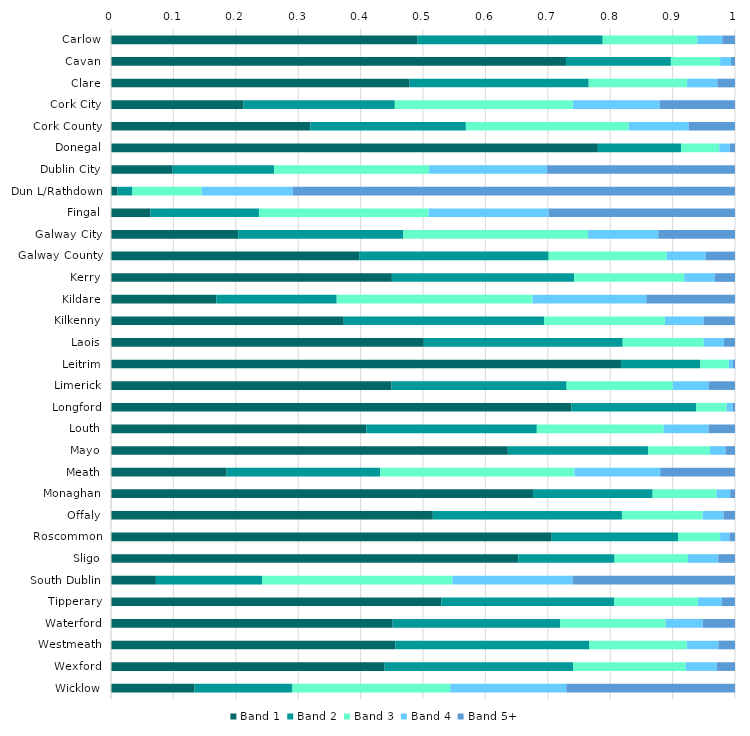
| Category | Band 1 | Band 2 | Band 3 | Band 4 | Band 5+ |
|---|---|---|---|---|---|
| Carlow | 0.491 | 0.297 | 0.152 | 0.04 | 0.02 |
| Cavan | 0.729 | 0.168 | 0.079 | 0.017 | 0.006 |
| Clare | 0.479 | 0.287 | 0.158 | 0.048 | 0.028 |
| Cork City | 0.212 | 0.242 | 0.285 | 0.139 | 0.121 |
| Cork County | 0.32 | 0.249 | 0.261 | 0.096 | 0.074 |
| Donegal | 0.78 | 0.133 | 0.061 | 0.017 | 0.008 |
| Dublin City | 0.099 | 0.163 | 0.248 | 0.189 | 0.301 |
| Dun L/Rathdown | 0.01 | 0.024 | 0.111 | 0.146 | 0.709 |
| Fingal | 0.063 | 0.174 | 0.272 | 0.192 | 0.299 |
| Galway City | 0.204 | 0.265 | 0.296 | 0.112 | 0.123 |
| Galway County | 0.398 | 0.304 | 0.189 | 0.062 | 0.047 |
| Kerry | 0.45 | 0.292 | 0.176 | 0.049 | 0.032 |
| Kildare | 0.169 | 0.193 | 0.314 | 0.182 | 0.142 |
| Kilkenny | 0.373 | 0.321 | 0.194 | 0.062 | 0.05 |
| Laois | 0.501 | 0.319 | 0.13 | 0.033 | 0.018 |
| Leitrim | 0.817 | 0.127 | 0.046 | 0.007 | 0.003 |
| Limerick | 0.45 | 0.28 | 0.17 | 0.057 | 0.042 |
| Longford | 0.738 | 0.2 | 0.049 | 0.01 | 0.004 |
| Louth | 0.409 | 0.273 | 0.203 | 0.072 | 0.042 |
| Mayo | 0.636 | 0.225 | 0.099 | 0.025 | 0.015 |
| Meath | 0.185 | 0.246 | 0.311 | 0.137 | 0.12 |
| Monaghan | 0.676 | 0.192 | 0.102 | 0.022 | 0.008 |
| Offaly | 0.516 | 0.303 | 0.13 | 0.033 | 0.019 |
| Roscommon | 0.706 | 0.202 | 0.067 | 0.015 | 0.009 |
| Sligo | 0.653 | 0.154 | 0.118 | 0.049 | 0.027 |
| South Dublin | 0.072 | 0.17 | 0.305 | 0.193 | 0.26 |
| Tipperary | 0.529 | 0.277 | 0.134 | 0.038 | 0.021 |
| Waterford | 0.451 | 0.268 | 0.169 | 0.059 | 0.052 |
| Westmeath | 0.456 | 0.311 | 0.156 | 0.051 | 0.027 |
| Wexford | 0.439 | 0.302 | 0.181 | 0.05 | 0.029 |
| Wicklow | 0.134 | 0.157 | 0.253 | 0.186 | 0.27 |